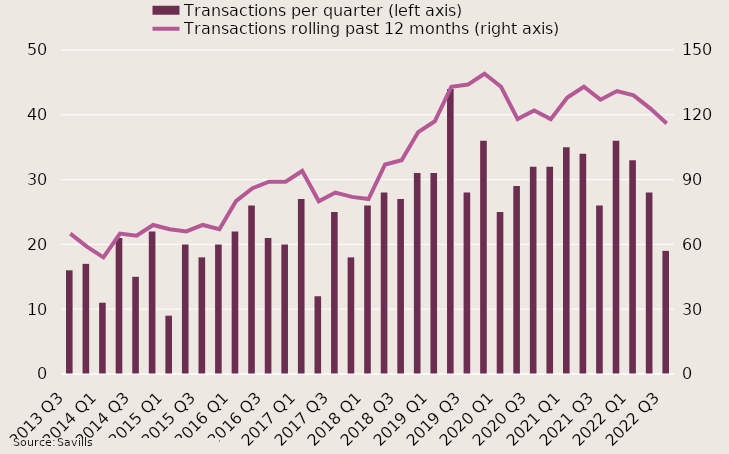
| Category | Transactions per quarter (left axis) |
|---|---|
| 2013 Q3 | 16 |
| 2013 Q4 | 17 |
| 2014 Q1 | 11 |
| 2014 Q2 | 21 |
| 2014 Q3 | 15 |
| 2014 Q4 | 22 |
| 2015 Q1 | 9 |
| 2015 Q2 | 20 |
| 2015 Q3 | 18 |
| 2015 Q4 | 20 |
| 2016 Q1 | 22 |
| 2016 Q2 | 26 |
| 2016 Q3 | 21 |
| 2016 Q4 | 20 |
| 2017 Q1 | 27 |
| 2017 Q2 | 12 |
| 2017 Q3 | 25 |
| 2017 Q4 | 18 |
| 2018 Q1 | 26 |
| 2018 Q2 | 28 |
| 2018 Q3 | 27 |
| 2018 Q4 | 31 |
| 2019 Q1 | 31 |
| 2019 Q2 | 44 |
| 2019 Q3 | 28 |
| 2019 Q4 | 36 |
| 2020 Q1 | 25 |
| 2020 Q2 | 29 |
| 2020 Q3 | 32 |
| 2020 Q4 | 32 |
| 2021 Q1 | 35 |
| 2021 Q2 | 34 |
| 2021 Q3 | 26 |
| 2021 Q4 | 36 |
| 2022 Q1 | 33 |
| 2022 Q2 | 28 |
| 2022 Q3 | 19 |